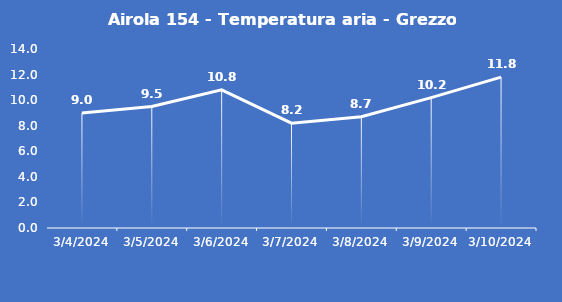
| Category | Airola 154 - Temperatura aria - Grezzo (°C) |
|---|---|
| 3/4/24 | 9 |
| 3/5/24 | 9.5 |
| 3/6/24 | 10.8 |
| 3/7/24 | 8.2 |
| 3/8/24 | 8.7 |
| 3/9/24 | 10.2 |
| 3/10/24 | 11.8 |